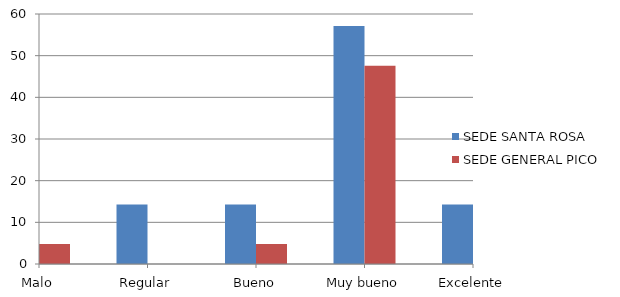
| Category | SEDE SANTA ROSA | SEDE GENERAL PICO |
|---|---|---|
| Malo | 0 | 4.8 |
| Regular | 14.3 | 0 |
| Bueno | 14.3 | 4.8 |
| Muy bueno | 57.1 | 47.6 |
| Excelente | 14.3 | 42.9 |